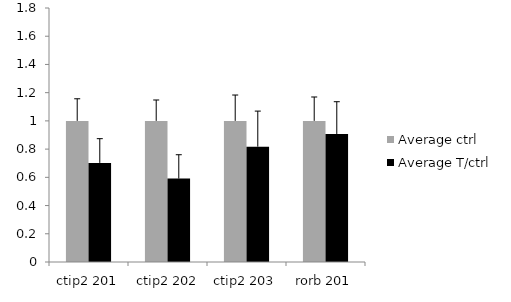
| Category | Average ctrl | Average T/ctrl |
|---|---|---|
|  ctip2 201 | 1 | 0.702 |
|  ctip2 202 | 1 | 0.591 |
| ctip2 203 | 1 | 0.817 |
| rorb 201 | 1 | 0.907 |